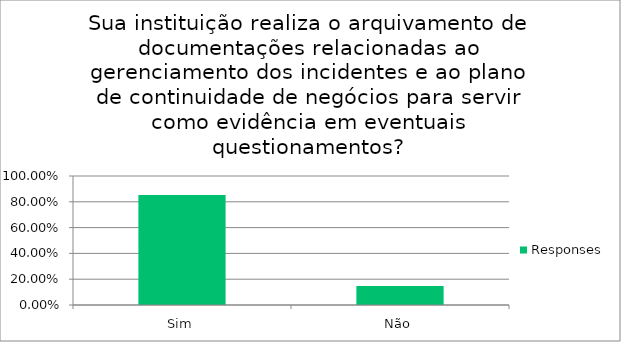
| Category | Responses |
|---|---|
| Sim | 0.853 |
| Não | 0.147 |